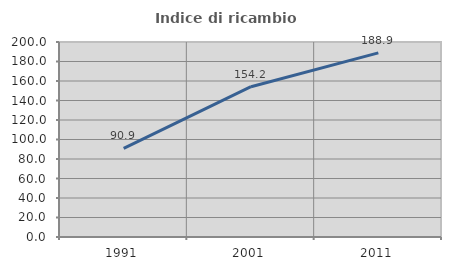
| Category | Indice di ricambio occupazionale  |
|---|---|
| 1991.0 | 90.909 |
| 2001.0 | 154.167 |
| 2011.0 | 188.889 |